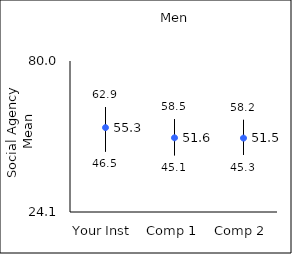
| Category | 25th percentile | 75th percentile | Mean |
|---|---|---|---|
| Your Inst | 46.5 | 62.9 | 55.34 |
| Comp 1 | 45.1 | 58.5 | 51.57 |
| Comp 2 | 45.3 | 58.2 | 51.46 |